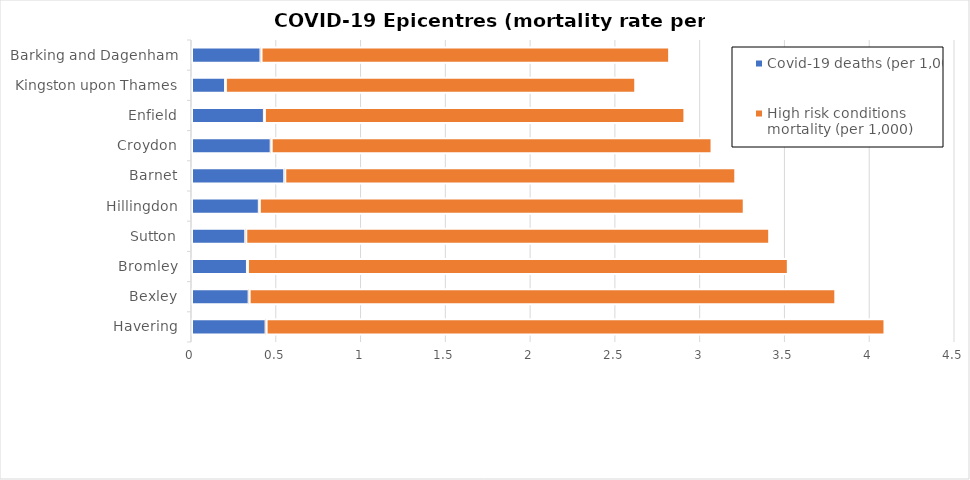
| Category | Covid-19 deaths (per 1,000) | High risk conditions mortality (per 1,000) |
|---|---|---|
| Havering | 0.44 | 3.65 |
| Bexley | 0.34 | 3.46 |
| Bromley | 0.33 | 3.19 |
| Sutton | 0.32 | 3.09 |
| Hillingdon | 0.4 | 2.86 |
| Barnet | 0.55 | 2.66 |
| Croydon | 0.47 | 2.6 |
| Enfield | 0.43 | 2.48 |
| Kingston upon Thames | 0.2 | 2.42 |
| Barking and Dagenham | 0.41 | 2.41 |